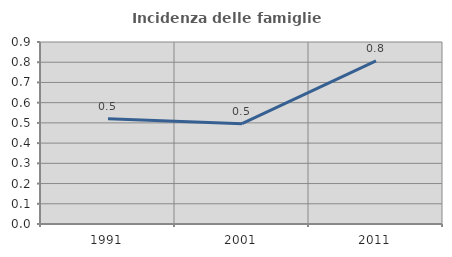
| Category | Incidenza delle famiglie numerose |
|---|---|
| 1991.0 | 0.521 |
| 2001.0 | 0.496 |
| 2011.0 | 0.806 |